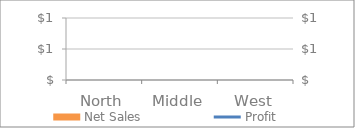
| Category | Net Sales |
|---|---|
| North | 0 |
| Middle | 0 |
| West | 0 |